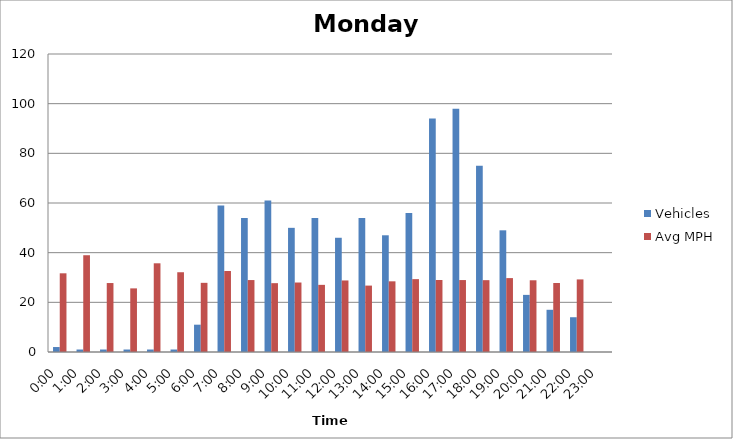
| Category | Vehicles | Avg MPH |
|---|---|---|
| 0:00 | 2 | 31.69 |
| 1:00 | 1 | 38.97 |
| 2:00 | 1 | 27.77 |
| 3:00 | 1 | 25.62 |
| 4:00 | 1 | 35.72 |
| 5:00 | 1 | 32.12 |
| 6:00 | 11 | 27.85 |
| 7:00 | 59 | 32.61 |
| 8:00 | 54 | 28.97 |
| 9:00 | 61 | 27.72 |
| 10:00 | 50 | 27.98 |
| 11:00 | 54 | 27.04 |
| 12:00 | 46 | 28.81 |
| 13:00 | 54 | 26.74 |
| 14:00 | 47 | 28.46 |
| 15:00 | 56 | 29.34 |
| 16:00 | 94 | 28.99 |
| 17:00 | 98 | 28.97 |
| 18:00 | 75 | 28.93 |
| 19:00 | 49 | 29.76 |
| 20:00 | 23 | 28.88 |
| 21:00 | 17 | 27.78 |
| 22:00 | 14 | 29.23 |
| 23:00 | 0 | 0 |